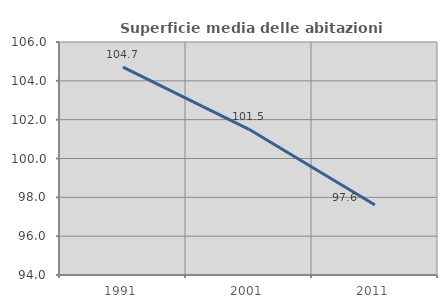
| Category | Superficie media delle abitazioni occupate |
|---|---|
| 1991.0 | 104.702 |
| 2001.0 | 101.503 |
| 2011.0 | 97.604 |